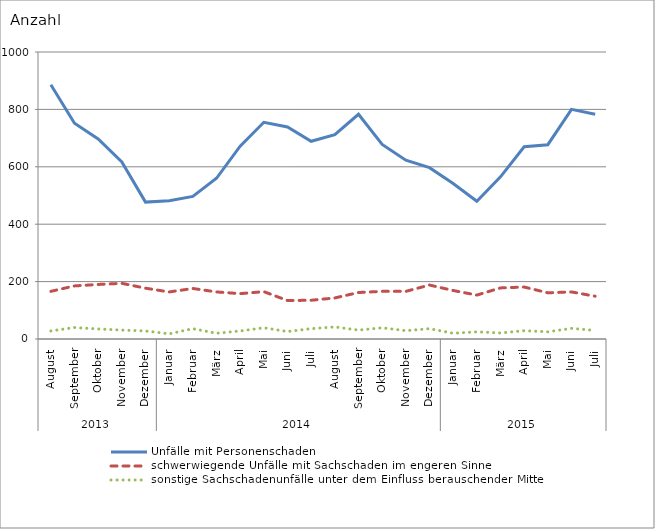
| Category | Unfälle mit Personenschaden | schwerwiegende Unfälle mit Sachschaden im engeren Sinne | sonstige Sachschadenunfälle unter dem Einfluss berauschender Mittel |
|---|---|---|---|
| 0 | 886 | 166 | 28 |
| 1 | 752 | 185 | 40 |
| 2 | 697 | 190 | 35 |
| 3 | 617 | 194 | 31 |
| 4 | 477 | 177 | 28 |
| 5 | 482 | 164 | 18 |
| 6 | 497 | 176 | 36 |
| 7 | 560 | 164 | 20 |
| 8 | 672 | 158 | 28 |
| 9 | 755 | 165 | 39 |
| 10 | 739 | 134 | 26 |
| 11 | 689 | 135 | 36 |
| 12 | 712 | 143 | 42 |
| 13 | 783 | 162 | 31 |
| 14 | 678 | 166 | 39 |
| 15 | 623 | 166 | 29 |
| 16 | 597 | 188 | 36 |
| 17 | 542 | 169 | 20 |
| 18 | 480 | 153 | 25 |
| 19 | 565 | 178 | 21 |
| 20 | 670 | 181 | 29 |
| 21 | 677 | 161 | 25 |
| 22 | 800 | 164 | 37 |
| 23 | 783 | 149 | 30 |